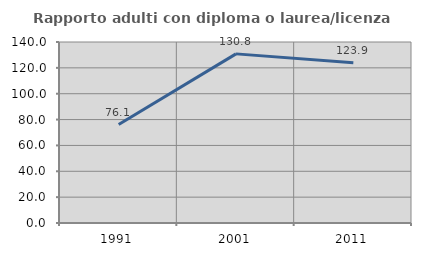
| Category | Rapporto adulti con diploma o laurea/licenza media  |
|---|---|
| 1991.0 | 76.129 |
| 2001.0 | 130.814 |
| 2011.0 | 123.902 |